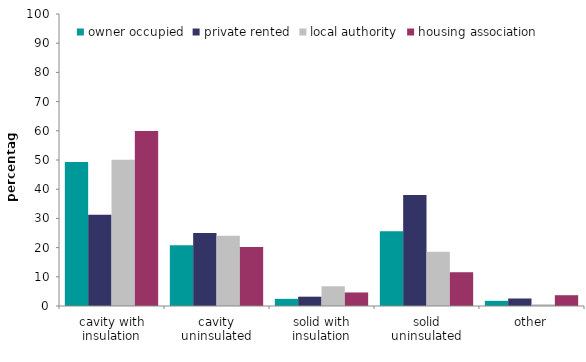
| Category | owner occupied | private rented | local authority | housing association |
|---|---|---|---|---|
| cavity with insulation | 49.334 | 31.253 | 50.052 | 59.891 |
| cavity uninsulated | 20.812 | 24.964 | 24.043 | 20.212 |
| solid with insulation | 2.444 | 3.188 | 6.756 | 4.639 |
| solid uninsulated | 25.641 | 38.026 | 18.566 | 11.565 |
| other | 1.77 | 2.569 | 0.583 | 3.695 |